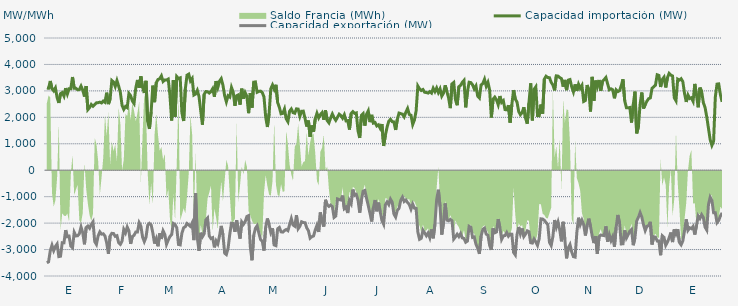
| Category | Capacidad importación (MW) | Capacidad exportación (MW) |
|---|---|---|
| 0 | 3106.083 | -3500.875 |
| 1900-01-01 | 3099.042 | -3464.417 |
| 1900-01-02 | 3374.208 | -3046.25 |
| 1900-01-03 | 3081.083 | -2836.417 |
| 1900-01-04 | 3002 | -3040.417 |
| 1900-01-05 | 3113.875 | -2884.417 |
| 1900-01-06 | 2746.792 | -2789.333 |
| 1900-01-07 | 2544 | -3266.167 |
| 1900-01-08 | 2896.458 | -3250.667 |
| 1900-01-09 | 2937 | -2740.375 |
| 1900-01-10 | 2803.458 | -2745 |
| 1900-01-11 | 3104.125 | -2267.833 |
| 1900-01-12 | 2884.333 | -2514.583 |
| 1900-01-13 | 3081.042 | -2493.458 |
| 1900-01-14 | 3079.083 | -2866 |
| 1900-01-15 | 3524.292 | -2932.083 |
| 1900-01-16 | 3096.5 | -2347.083 |
| 1900-01-17 | 3096.5 | -2484.875 |
| 1900-01-18 | 3044.417 | -2478.583 |
| 1900-01-19 | 3048.167 | -2403.5 |
| 1900-01-20 | 3181.083 | -2147.542 |
| 1900-01-21 | 3030.708 | -2365.833 |
| 1900-01-22 | 2784.5 | -2801.333 |
| 1900-01-23 | 3182.417 | -2165.083 |
| 1900-01-24 | 2292.583 | -2110.5 |
| 1900-01-25 | 2370.25 | -2192.75 |
| 1900-01-26 | 2487.208 | -2051.417 |
| 1900-01-27 | 2421.292 | -1952.083 |
| 1900-01-28 | 2482.917 | -2699.375 |
| 1900-01-29 | 2548.458 | -2805.375 |
| 1900-01-30 | 2554.458 | -2484.042 |
| 1900-01-31 | 2574.083 | -2331.417 |
| 1900-02-01 | 2544.458 | -2417.833 |
| 1900-02-02 | 2615.833 | -2403.25 |
| 1900-02-03 | 2568.917 | -2488.625 |
| 1900-02-04 | 2932.208 | -2748.875 |
| 1900-02-05 | 2500.875 | -3160.125 |
| 1900-02-06 | 2689.458 | -2491.667 |
| 1900-02-07 | 3392.292 | -2386.5 |
| 1900-02-08 | 3335.083 | -2392.75 |
| 1900-02-09 | 3167.5 | -2500.5 |
| 1900-02-10 | 3390.625 | -2475.917 |
| 1900-02-11 | 3180.958 | -2741.75 |
| 1900-02-12 | 2936.5 | -2801.625 |
| 1900-02-13 | 2452.792 | -2674.667 |
| 1900-02-14 | 2300.208 | -2235.25 |
| 1900-02-15 | 2411.792 | -2365.167 |
| 1900-02-16 | 2366.75 | -2147.917 |
| 1900-02-17 | 2902.042 | -2292.875 |
| 1900-02-18 | 2822.25 | -2784.375 |
| 1900-02-19 | 2619.333 | -2505.792 |
| 1900-02-20 | 2523.292 | -2462.542 |
| 1900-02-21 | 3101.75 | -2337.5 |
| 1900-02-22 | 3414.042 | -2335.5 |
| 1900-02-23 | 3119.417 | -1987.458 |
| 1900-02-24 | 3547.333 | -2114.583 |
| 1900-02-25 | 3135.708 | -2530.042 |
| 1900-02-26 | 2921.125 | -2699.333 |
| 1900-02-27 | 3380.917 | -2535.75 |
| 1900-02-28 | 1842.042 | -2078.542 |
| 1900-02-28 | 1566.833 | -2010.417 |
| 1900-03-01 | 2214.542 | -2066.667 |
| 1900-03-02 | 3198.583 | -2370 |
| 1900-03-03 | 2574 | -2772.958 |
| 1900-03-04 | 3310.583 | -2592.083 |
| 1900-03-05 | 3430.75 | -2875.542 |
| 1900-03-06 | 3458.333 | -2387.75 |
| 1900-03-07 | 3568.125 | -2599.208 |
| 1900-03-08 | 3355.708 | -2294.333 |
| 1900-03-09 | 3414.333 | -2427 |
| 1900-03-10 | 3410.542 | -2802.125 |
| 1900-03-11 | 3447.375 | -2640.958 |
| 1900-03-12 | 2831.208 | -2506.667 |
| 1900-03-13 | 1881.583 | -2434.25 |
| 1900-03-14 | 3406.708 | -2011.583 |
| 1900-03-15 | 2022.5 | -2050 |
| 1900-03-16 | 3540.875 | -2176.417 |
| 1900-03-17 | 3466.542 | -2807.167 |
| 1900-03-18 | 3493.375 | -2823.167 |
| 1900-03-19 | 2166.833 | -2382.125 |
| 1900-03-20 | 1859.958 | -2177.167 |
| 1900-03-21 | 3077.875 | -2132.833 |
| 1900-03-22 | 3595.75 | -2015.417 |
| 1900-03-23 | 3634.375 | -2069.417 |
| 1900-03-24 | 3379.833 | -2125 |
| 1900-03-25 | 3470.304 | -1991.957 |
| 1900-03-26 | 2844 | -2641.708 |
| 1900-03-27 | 2880.625 | -862.5 |
| 1900-03-28 | 3017.208 | -2558.208 |
| 1900-03-29 | 2787.708 | -3047.042 |
| 1900-03-30 | 2256.625 | -2365.667 |
| 1900-03-31 | 1722.917 | -2515.917 |
| 1900-04-01 | 2869 | -2405.667 |
| 1900-04-02 | 2973.167 | -1879.167 |
| 1900-04-03 | 2971 | -1806.25 |
| 1900-04-04 | 2919.208 | -2484.833 |
| 1900-04-05 | 2973.125 | -2583.917 |
| 1900-04-06 | 3083.25 | -2551.375 |
| 1900-04-07 | 2777.875 | -2917.292 |
| 1900-04-08 | 3371.833 | -2672.292 |
| 1900-04-09 | 3131 | -2785.25 |
| 1900-04-10 | 3368.375 | -2480.958 |
| 1900-04-11 | 3462.292 | -2105.333 |
| 1900-04-12 | 3215.917 | -2442.958 |
| 1900-04-13 | 2817.875 | -3136.917 |
| 1900-04-14 | 2586 | -3188.792 |
| 1900-04-15 | 2815 | -2954.042 |
| 1900-04-16 | 2767 | -2418.75 |
| 1900-04-17 | 3129.208 | -2005 |
| 1900-04-18 | 2953.792 | -2013.417 |
| 1900-04-19 | 2437.083 | -2329.833 |
| 1900-04-20 | 2815.958 | -1889.333 |
| 1900-04-21 | 2849.708 | -2257.667 |
| 1900-04-22 | 2479.208 | -2586.833 |
| 1900-04-23 | 3084.333 | -1954.5 |
| 1900-04-24 | 2707.042 | -2046.583 |
| 1900-04-25 | 2933.542 | -1941.667 |
| 1900-04-26 | 2795.917 | -1750 |
| 1900-04-27 | 2158.042 | -1718.75 |
| 1900-04-28 | 2918.875 | -2898.083 |
| 1900-04-29 | 2368.375 | -3404.167 |
| 1900-04-30 | 3329.75 | -2465.083 |
| 1900-05-01 | 3339.208 | -2197.25 |
| 1900-05-02 | 2948.5 | -2100.583 |
| 1900-05-03 | 2980.792 | -2371.042 |
| 1900-05-04 | 2990.708 | -2620.708 |
| 1900-05-05 | 2938.333 | -2683 |
| 1900-05-06 | 2774.542 | -3036.75 |
| 1900-05-07 | 2014.917 | -2156.292 |
| 1900-05-08 | 1635.417 | -1825.292 |
| 1900-05-09 | 2140.25 | -2060.75 |
| 1900-05-10 | 3080.917 | -2353.125 |
| 1900-05-11 | 3223.333 | -2199.083 |
| 1900-05-12 | 3058.083 | -2827.667 |
| 1900-05-13 | 3231.167 | -2853.292 |
| 1900-05-14 | 2562 | -2213.625 |
| 1900-05-15 | 2375 | -2164.25 |
| 1900-05-16 | 2133.333 | -2329.5 |
| 1900-05-17 | 2150 | -2341.083 |
| 1900-05-18 | 2314.583 | -2282 |
| 1900-05-19 | 1943.75 | -2242.25 |
| 1900-05-20 | 1835.625 | -2285.208 |
| 1900-05-21 | 2235.417 | -2055.542 |
| 1900-05-22 | 2316.667 | -1831.25 |
| 1900-05-23 | 2178.125 | -2071.583 |
| 1900-05-24 | 2154.167 | -2116.125 |
| 1900-05-25 | 2321.417 | -1699.458 |
| 1900-05-26 | 2312 | -2210.167 |
| 1900-05-27 | 2040.917 | -2118.083 |
| 1900-05-28 | 2233.083 | -1949.458 |
| 1900-05-29 | 2234.854 | -1977.083 |
| 1900-05-30 | 1964.583 | -1985.792 |
| 1900-05-31 | 1650 | -2177.417 |
| 1900-06-01 | 1877.083 | -2287.667 |
| 1900-06-02 | 1264.583 | -2568.708 |
| 1900-06-03 | 1691.667 | -2512.667 |
| 1900-06-04 | 1456.25 | -2486.333 |
| 1900-06-05 | 1945.833 | -2259.083 |
| 1900-06-06 | 2154.167 | -2079.5 |
| 1900-06-07 | 1979.167 | -2336.083 |
| 1900-06-08 | 2104.167 | -1597.917 |
| 1900-06-09 | 2179.167 | -1954.167 |
| 1900-06-10 | 1908.333 | -2131.25 |
| 1900-06-11 | 2262.5 | -1118.75 |
| 1900-06-12 | 1879.167 | -1314.583 |
| 1900-06-13 | 1791.667 | -1368 |
| 1900-06-14 | 1977.083 | -1316.667 |
| 1900-06-15 | 2127.083 | -1377.083 |
| 1900-06-16 | 1987.5 | -1785.417 |
| 1900-06-17 | 1887.5 | -1733.333 |
| 1900-06-18 | 2002.083 | -1085.417 |
| 1900-06-19 | 2118.75 | -1110.417 |
| 1900-06-20 | 2066.667 | -1125 |
| 1900-06-21 | 1966.667 | -958.333 |
| 1900-06-22 | 2097.917 | -1454.167 |
| 1900-06-23 | 1864.583 | -1397.917 |
| 1900-06-24 | 1877.083 | -1618.75 |
| 1900-06-25 | 1537.5 | -1143.75 |
| 1900-06-26 | 2145.833 | -1264 |
| 1900-06-27 | 2216.667 | -731.25 |
| 1900-06-28 | 2150 | -950 |
| 1900-06-29 | 2167.583 | -916.667 |
| 1900-06-30 | 1493.75 | -1122.25 |
| 1900-07-01 | 1220.833 | -1604.167 |
| 1900-07-02 | 2072.917 | -1125 |
| 1900-07-03 | 2139.583 | -791.667 |
| 1900-07-04 | 1687.5 | -764.583 |
| 1900-07-05 | 2116.667 | -1058.333 |
| 1900-07-06 | 2247.917 | -1337.5 |
| 1900-07-07 | 1818.75 | -1627.083 |
| 1900-07-08 | 2093.75 | -1937.5 |
| 1900-07-09 | 1781.25 | -1422.917 |
| 1900-07-10 | 1804.167 | -1127.083 |
| 1900-07-11 | 1675 | -1552.083 |
| 1900-07-12 | 1716.667 | -1225 |
| 1900-07-13 | 1583.333 | -1570.833 |
| 1900-07-14 | 1747.917 | -1904.167 |
| 1900-07-15 | 918.75 | -2042.875 |
| 1900-07-16 | 1314.583 | -1310.417 |
| 1900-07-17 | 1629.167 | -1200 |
| 1900-07-18 | 1852.083 | -1300.583 |
| 1900-07-19 | 1925 | -1095.833 |
| 1900-07-20 | 1835.417 | -1208.333 |
| 1900-07-21 | 1827.083 | -1656.25 |
| 1900-07-22 | 1522.917 | -1770.917 |
| 1900-07-23 | 1916.667 | -1518.75 |
| 1900-07-24 | 2160.417 | -1441.667 |
| 1900-07-25 | 2139.583 | -1137.5 |
| 1900-07-26 | 2120.833 | -1018.75 |
| 1900-07-27 | 2018.75 | -1183.333 |
| 1900-07-28 | 2193.75 | -1127.083 |
| 1900-07-29 | 2333.333 | -1220.833 |
| 1900-07-30 | 2108.333 | -1295.833 |
| 1900-07-31 | 2079.833 | -1472.917 |
| 1900-08-01 | 1729.167 | -1281.25 |
| 1900-08-02 | 1897.917 | -1434.542 |
| 1900-08-03 | 2247 | -1443.75 |
| 1900-08-04 | 3185.083 | -2337 |
| 1900-08-05 | 3075.167 | -2613.625 |
| 1900-08-06 | 3013.625 | -2576.5 |
| 1900-08-07 | 3052.042 | -2269.25 |
| 1900-08-08 | 2946.333 | -2370.833 |
| 1900-08-09 | 2940.542 | -2478.958 |
| 1900-08-10 | 2917.208 | -2375.625 |
| 1900-08-11 | 2971.167 | -2551.875 |
| 1900-08-12 | 2917.292 | -2238 |
| 1900-08-13 | 3101.958 | -2573.167 |
| 1900-08-14 | 2973.375 | -2041.667 |
| 1900-08-15 | 3109.875 | -1120.167 |
| 1900-08-16 | 2936.333 | -737.5 |
| 1900-08-17 | 3074.833 | -1371.667 |
| 1900-08-18 | 2802.417 | -2434.917 |
| 1900-08-19 | 2913.625 | -1996.875 |
| 1900-08-20 | 3212.125 | -1254.167 |
| 1900-08-21 | 2973 | -1887.5 |
| 1900-08-22 | 2732 | -1910.417 |
| 1900-08-23 | 2348.333 | -1858 |
| 1900-08-24 | 3266 | -1911.25 |
| 1900-08-25 | 3318.417 | -2603.917 |
| 1900-08-26 | 2666.292 | -2519.292 |
| 1900-08-27 | 2457.667 | -2420.375 |
| 1900-08-28 | 3159.917 | -2510.583 |
| 1900-08-29 | 3208.208 | -2395.833 |
| 1900-08-30 | 3322.042 | -2559.25 |
| 1900-08-31 | 3397.292 | -2579.208 |
| 1900-09-01 | 2377.292 | -2722 |
| 1900-09-02 | 2966.875 | -2678.583 |
| 1900-09-03 | 3327.583 | -2120.833 |
| 1900-09-04 | 3314.125 | -2154.167 |
| 1900-09-05 | 3229.625 | -2542.417 |
| 1900-09-06 | 3075.125 | -2524.125 |
| 1900-09-07 | 3186.833 | -2800.875 |
| 1900-09-08 | 2804.417 | -2944.208 |
| 1900-09-09 | 2733.75 | -3162.5 |
| 1900-09-10 | 3225.458 | -2491.042 |
| 1900-09-11 | 3275.667 | -2238.417 |
| 1900-09-12 | 3439.5 | -2190.417 |
| 1900-09-13 | 3175.292 | -2417.375 |
| 1900-09-14 | 3321.875 | -2458.417 |
| 1900-09-15 | 3034.917 | -2846.167 |
| 1900-09-16 | 1991.917 | -3010.667 |
| 1900-09-17 | 2685.833 | -2200.25 |
| 1900-09-18 | 2763.167 | -2365.208 |
| 1900-09-19 | 2664.875 | -2334.375 |
| 1900-09-20 | 2477.792 | -1849.417 |
| 1900-09-21 | 2804.25 | -2175.083 |
| 1900-09-22 | 2563.458 | -2614.833 |
| 1900-09-23 | 2629.917 | -2484.333 |
| 1900-09-24 | 2292 | -2469.792 |
| 1900-09-25 | 2284.542 | -2356.917 |
| 1900-09-26 | 2456.5 | -2494.792 |
| 1900-09-27 | 1801.792 | -2413.833 |
| 1900-09-28 | 2484.917 | -2419 |
| 1900-09-29 | 3029.417 | -3108.292 |
| 1900-09-30 | 2693.417 | -3201.125 |
| 1900-10-01 | 2579.5 | -2439 |
| 1900-10-02 | 2220.833 | -2146.167 |
| 1900-10-03 | 2100 | -2410.292 |
| 1900-10-04 | 2179.167 | -2202.083 |
| 1900-10-05 | 2381.25 | -2508.5 |
| 1900-10-06 | 1970.833 | -2414.375 |
| 1900-10-07 | 1758.333 | -2292.792 |
| 1900-10-08 | 2544 | -2324.083 |
| 1900-10-09 | 3285.125 | -2739.75 |
| 1900-10-10 | 1885.375 | -2754.917 |
| 1900-10-11 | 3057.958 | -2601 |
| 1900-10-12 | 3152.583 | -2708.375 |
| 1900-10-13 | 2068.833 | -2840.833 |
| 1900-10-14 | 2060.917 | -2586.417 |
| 1900-10-15 | 2484.25 | -1839.417 |
| 1900-10-16 | 2141.208 | -1845.833 |
| 1900-10-17 | 3445.375 | -1893.75 |
| 1900-10-18 | 3555.25 | -1979.583 |
| 1900-10-19 | 3506.875 | -2054.167 |
| 1900-10-20 | 3499.292 | -2730 |
| 1900-10-21 | 3321.917 | -2848.375 |
| 1900-10-22 | 3225.583 | -2505.583 |
| 1900-10-23 | 3019.583 | -1882.958 |
| 1900-10-24 | 3568.667 | -2157.833 |
| 1900-10-25 | 3559.375 | -1957.75 |
| 1900-10-26 | 3503.125 | -2252.375 |
| 1900-10-27 | 3464.458 | -2689.458 |
| 1900-10-28 | 3159.52 | -1949.52 |
| 1900-10-29 | 3414.875 | -2624.75 |
| 1900-10-30 | 3028.417 | -3331.875 |
| 1900-10-31 | 3406.833 | -2936.5 |
| 1900-11-01 | 3428.875 | -2811.25 |
| 1900-11-02 | 3154.208 | -3088.625 |
| 1900-11-03 | 2961.542 | -3268.083 |
| 1900-11-04 | 3246.75 | -3285.125 |
| 1900-11-05 | 2998.792 | -2359.333 |
| 1900-11-06 | 3250.625 | -1795.833 |
| 1900-11-07 | 3098.083 | -2058.458 |
| 1900-11-08 | 3208.458 | -1889.583 |
| 1900-11-09 | 2600.833 | -2050 |
| 1900-11-10 | 2636.458 | -2468.208 |
| 1900-11-11 | 3221.75 | -2100 |
| 1900-11-12 | 3030.917 | -1831.25 |
| 1900-11-13 | 2221.417 | -2127.083 |
| 1900-11-14 | 3529.833 | -2490.5 |
| 1900-11-15 | 2631.583 | -2756.25 |
| 1900-11-16 | 3389.417 | -2493.667 |
| 1900-11-17 | 3161.917 | -3158.375 |
| 1900-11-18 | 3412.417 | -2518.792 |
| 1900-11-19 | 3004.917 | -2450.333 |
| 1900-11-20 | 3360.75 | -2463.25 |
| 1900-11-21 | 3427.958 | -2474.292 |
| 1900-11-22 | 3506.917 | -2123.5 |
| 1900-11-23 | 3269.708 | -2701.708 |
| 1900-11-24 | 3043.333 | -2440.417 |
| 1900-11-25 | 3078.833 | -2660.667 |
| 1900-11-26 | 3042.542 | -2510.25 |
| 1900-11-27 | 2720.083 | -2892.208 |
| 1900-11-28 | 3035.792 | -2156.833 |
| 1900-11-29 | 2973.125 | -1691.667 |
| 1900-11-30 | 3008.708 | -2006.25 |
| 1900-12-01 | 3198.417 | -2788.271 |
| 1900-12-02 | 3439.5 | -2780.875 |
| 1900-12-03 | 2626.625 | -2273 |
| 1900-12-04 | 2364.583 | -2564.167 |
| 1900-12-05 | 2360.417 | -2440.708 |
| 1900-12-06 | 2372.917 | -2302.125 |
| 1900-12-07 | 1804.167 | -2241.25 |
| 1900-12-08 | 2476.875 | -2836.292 |
| 1900-12-09 | 2972.208 | -2552.292 |
| 1900-12-10 | 1394.917 | -1922 |
| 1900-12-11 | 1635.417 | -1780.667 |
| 1900-12-12 | 2487.208 | -1602.083 |
| 1900-12-13 | 2938.333 | -1770.833 |
| 1900-12-14 | 2333.708 | -2058.75 |
| 1900-12-15 | 2480.333 | -2280.5 |
| 1900-12-16 | 2612.458 | -2120.333 |
| 1900-12-17 | 2705.792 | -2095.25 |
| 1900-12-18 | 2735.375 | -1951.833 |
| 1900-12-19 | 3100.375 | -2807.583 |
| 1900-12-20 | 3154.125 | -2514.417 |
| 1900-12-21 | 3216.042 | -2530.208 |
| 1900-12-22 | 3609.167 | -2672.875 |
| 1900-12-23 | 3585.958 | -2674.5 |
| 1900-12-24 | 3148.417 | -3214.25 |
| 1900-12-25 | 3433.542 | -2480.667 |
| 1900-12-26 | 3518.5 | -2539.5 |
| 1900-12-27 | 3130.292 | -2838.583 |
| 1900-12-28 | 3499.167 | -2718.417 |
| 1900-12-29 | 3663.042 | -2554.083 |
| 1900-12-30 | 3596.708 | -2355.75 |
| 1900-12-31 | 3562.792 | -2716.417 |
| 1901-01-01 | 2738.75 | -2235.333 |
| 1901-01-02 | 2625.667 | -2410 |
| 1901-01-03 | 3444.083 | -2226.333 |
| 1901-01-04 | 3408.75 | -2728 |
| 1901-01-05 | 3460.583 | -2820.25 |
| 1901-01-06 | 3350.75 | -2676.083 |
| 1901-01-07 | 2899.917 | -2289.583 |
| 1901-01-08 | 2581.708 | -1858.083 |
| 1901-01-09 | 2842.042 | -2272.417 |
| 1901-01-10 | 2711.125 | -2177.417 |
| 1901-01-11 | 2740.458 | -2209.667 |
| 1901-01-12 | 2608.583 | -2127.083 |
| 1901-01-13 | 3264.042 | -2433.083 |
| 1901-01-14 | 2836.375 | -2085.417 |
| 1901-01-15 | 2379.792 | -1727.083 |
| 1901-01-16 | 3123.25 | -1827.083 |
| 1901-01-17 | 2982.792 | -1681.25 |
| 1901-01-18 | 2556.667 | -1789.667 |
| 1901-01-19 | 2375.667 | -2149.333 |
| 1901-01-20 | 2017.208 | -2261.458 |
| 1901-01-21 | 1585 | -1297.917 |
| 1901-01-22 | 1154.167 | -1022.917 |
| 1901-01-23 | 939.583 | -1143.75 |
| 1901-01-24 | 1093.75 | -1604.167 |
| 1901-01-25 | 2763.333 | -1604.167 |
| 1901-01-26 | 3256.375 | -1980.875 |
| 1901-01-27 | 3265.958 | -1897.917 |
| 1901-01-28 | 2849.625 | -1726.333 |
| 1901-01-29 | 2586.542 | -1614.583 |